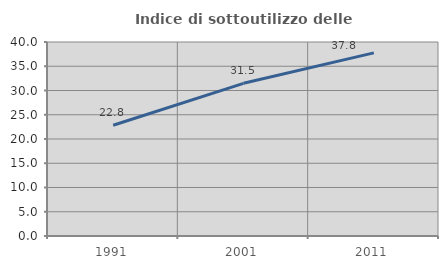
| Category | Indice di sottoutilizzo delle abitazioni  |
|---|---|
| 1991.0 | 22.83 |
| 2001.0 | 31.479 |
| 2011.0 | 37.757 |